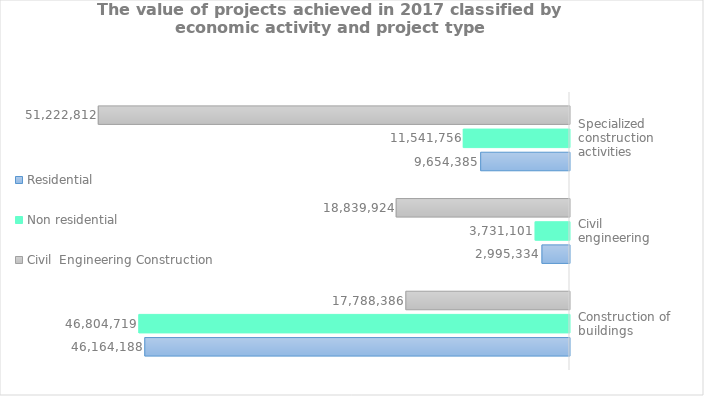
| Category |  Residential  |  Non residential  |  Civil  Engineering Construction  |
|---|---|---|---|
| Construction of buildings | 46164187.554 | 46804718.784 | 17788386.146 |
| Civil engineering | 2995334.169 | 3731100.589 | 18839923.618 |
| Specialized construction activities | 9654385.05 | 11541755.833 | 51222812.003 |